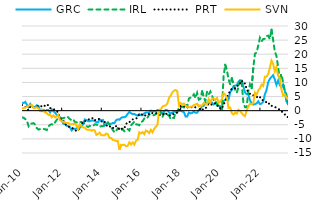
| Category | GRC | IRL | PRT | SVN |
|---|---|---|---|---|
| 2010-01-01 | 2.898 | -2.388 | 1.972 | 0.745 |
| 2010-02-01 | 2.692 | -2.499 | 1.778 | 0.901 |
| 2010-03-01 | 3.107 | -2.991 | 1.419 | 1.082 |
| 2010-04-01 | 2.054 | -3.565 | 0.441 | 1.371 |
| 2010-05-01 | 1.272 | -5.481 | 0.205 | 1.782 |
| 2010-06-01 | 2.364 | -4.56 | 1.414 | 1.905 |
| 2010-07-01 | 1.619 | -4.599 | 1.289 | 2.014 |
| 2010-08-01 | 1.168 | -4.428 | 1.112 | 0.894 |
| 2010-09-01 | 1.32 | -4.962 | 1.247 | 0.995 |
| 2010-10-01 | 1.915 | -6.22 | 1.552 | 1.234 |
| 2010-11-01 | 1.666 | -6.703 | 1.487 | 0.727 |
| 2010-12-01 | 0.033 | -6.511 | 1.717 | -0.137 |
| 2011-01-01 | -0.158 | -6.599 | 1.512 | 0.445 |
| 2011-02-01 | 0.274 | -6.498 | 1.27 | -0.188 |
| 2011-03-01 | -0.094 | -6.58 | 1.902 | -0.566 |
| 2011-04-01 | 0.246 | -6.889 | 2.273 | -0.887 |
| 2011-05-01 | 0.248 | -5.552 | 1.834 | -1.524 |
| 2011-06-01 | -0.63 | -5.024 | 0.917 | -1.443 |
| 2011-07-01 | 0.496 | -4.786 | 0.834 | -2.295 |
| 2011-08-01 | -0.215 | -5.069 | 0.602 | -1.661 |
| 2011-09-01 | -0.697 | -4.142 | 0.242 | -2.383 |
| 2011-10-01 | -1.512 | -3.246 | -0.099 | -2.08 |
| 2011-11-01 | -1.755 | -2.724 | -0.794 | -1.467 |
| 2011-12-01 | -2.446 | -2.401 | -2.714 | -3.39 |
| 2012-01-01 | -3.468 | -2.653 | -3.286 | -3.79 |
| 2012-02-01 | -4.606 | -2.674 | -3.48 | -3.937 |
| 2012-03-01 | -4.694 | -2.387 | -4.624 | -4.128 |
| 2012-04-01 | -5.34 | -2.055 | -5.295 | -4.403 |
| 2012-05-01 | -5.478 | -2.36 | -5.699 | -4.317 |
| 2012-06-01 | -5.829 | -3.04 | -5.745 | -4.872 |
| 2012-07-01 | -6.977 | -3.319 | -6.011 | -4.841 |
| 2012-08-01 | -6.385 | -3.022 | -6.399 | -4.711 |
| 2012-09-01 | -6.487 | -4.053 | -6.779 | -4.584 |
| 2012-10-01 | -6.283 | -4.126 | -7.255 | -5.231 |
| 2012-11-01 | -6.11 | -4.384 | -7.169 | -6.48 |
| 2012-12-01 | -6.116 | -4.02 | -5.235 | -4.842 |
| 2013-01-01 | -5.321 | -4.005 | -4.345 | -5.529 |
| 2013-02-01 | -4.925 | -4.264 | -4.437 | -5.967 |
| 2013-03-01 | -3.099 | -4.637 | -3.68 | -6.027 |
| 2013-04-01 | -3.341 | -5.466 | -3.637 | -6.654 |
| 2013-05-01 | -3.728 | -5.793 | -3.351 | -6.822 |
| 2013-06-01 | -3.758 | -5.38 | -2.763 | -6.722 |
| 2013-07-01 | -3.488 | -5.585 | -2.744 | -7.083 |
| 2013-08-01 | -3.49 | -5.434 | -2.619 | -6.834 |
| 2013-09-01 | -3.687 | -4.842 | -3.431 | -6.989 |
| 2013-10-01 | -4.103 | -4.927 | -3.033 | -8.593 |
| 2013-11-01 | -4.163 | -5.175 | -2.893 | -8.23 |
| 2013-12-01 | -3.098 | -5.704 | -3.041 | -7.811 |
| 2014-01-01 | -3.44 | -5.474 | -3.866 | -8.686 |
| 2014-02-01 | -3.291 | -5.525 | -3.525 | -8.699 |
| 2014-03-01 | -5.211 | -5.033 | -3.858 | -8.706 |
| 2014-04-01 | -4.61 | -4.733 | -5.15 | -8.131 |
| 2014-05-01 | -4.5 | -4.123 | -5.618 | -8.389 |
| 2014-06-01 | -4.65 | -5.007 | -5.436 | -9.663 |
| 2014-07-01 | -4.673 | -5.915 | -6.152 | -9.665 |
| 2014-08-01 | -4.368 | -6.904 | -6.253 | -10.363 |
| 2014-09-01 | -4.38 | -7.708 | -5.413 | -10.508 |
| 2014-10-01 | -3.344 | -7.116 | -5.513 | -10.742 |
| 2014-11-01 | -3.063 | -6.197 | -5.76 | -10.761 |
| 2014-12-01 | -3.204 | -6.402 | -6.81 | -13.906 |
| 2015-01-01 | -2.559 | -7.084 | -6.35 | -12.078 |
| 2015-02-01 | -2.265 | -6.483 | -6.517 | -12.206 |
| 2015-03-01 | -2.354 | -7.343 | -6.168 | -12.054 |
| 2015-04-01 | -1.979 | -6.958 | -4.781 | -12.627 |
| 2015-05-01 | -1.097 | -6.542 | -4.009 | -12.431 |
| 2015-06-01 | -0.476 | -7.049 | -4.091 | -11.191 |
| 2015-07-01 | -0.894 | -5.196 | -3.504 | -11.99 |
| 2015-08-01 | -1.233 | -4.584 | -3.091 | -11.239 |
| 2015-09-01 | -1.145 | -3.87 | -3.093 | -12.051 |
| 2015-10-01 | -1.559 | -4.832 | -2.768 | -10.621 |
| 2015-11-01 | -1.731 | -4.904 | -2.488 | -10.348 |
| 2015-12-01 | -1.218 | -5.167 | -1.152 | -7.646 |
| 2016-01-01 | -1.627 | -4.055 | -1.246 | -8.069 |
| 2016-02-01 | -1.643 | -3.748 | -1.38 | -7.559 |
| 2016-03-01 | -0.957 | -2.765 | -1.871 | -8.35 |
| 2016-04-01 | -0.674 | -2.28 | -1.601 | -7.031 |
| 2016-05-01 | -0.672 | -2.454 | -1.208 | -7.367 |
| 2016-06-01 | -0.592 | -1.294 | -1.176 | -7.968 |
| 2016-07-01 | 0.032 | -1.471 | -0.662 | -6.748 |
| 2016-08-01 | -0.215 | -1.698 | -0.894 | -7.686 |
| 2016-09-01 | -0.177 | -1.55 | -0.777 | -6.476 |
| 2016-10-01 | -0.182 | -1.243 | -0.94 | -5.701 |
| 2016-11-01 | 0.223 | -0.289 | -1.022 | -5.022 |
| 2016-12-01 | -0.194 | 0.165 | -1.423 | 0.351 |
| 2017-01-01 | -0.687 | -0.42 | -1.681 | 0.442 |
| 2017-02-01 | -0.631 | -2.255 | -1.546 | 1.455 |
| 2017-03-01 | -0.325 | -1.055 | -0.88 | 1.704 |
| 2017-04-01 | 0.278 | -0.873 | -0.813 | 1.891 |
| 2017-05-01 | 0.133 | -1.458 | -1.568 | 2.554 |
| 2017-06-01 | -0.586 | -1.744 | -1.671 | 4.551 |
| 2017-07-01 | -1.062 | -2.998 | -1.6 | 5.364 |
| 2017-08-01 | -0.639 | -2.529 | -1.121 | 6.459 |
| 2017-09-01 | -0.4 | -2.576 | -1.226 | 7.064 |
| 2017-10-01 | -0.378 | -0.454 | -1.095 | 7.316 |
| 2017-11-01 | -0.287 | -0.516 | -0.626 | 6.876 |
| 2017-12-01 | 0.022 | 1.224 | -0.254 | 1.942 |
| 2018-01-01 | -0.042 | 1.045 | 1.641 | 2.728 |
| 2018-02-01 | -0.278 | 1.428 | 1.539 | 2.231 |
| 2018-03-01 | -0.534 | 1.154 | 1.701 | 2.562 |
| 2018-04-01 | -2.047 | 2.274 | 1.094 | 1.736 |
| 2018-05-01 | -2.043 | 1.424 | 1.353 | 1.437 |
| 2018-06-01 | -0.682 | 4.293 | 1.063 | 1.164 |
| 2018-07-01 | -0.953 | 4.598 | 1.197 | 1.404 |
| 2018-08-01 | -0.821 | 4.852 | 1.248 | 1.435 |
| 2018-09-01 | -0.29 | 5.783 | 1.395 | 1.975 |
| 2018-10-01 | -0.758 | 4.44 | 1.173 | 2.195 |
| 2018-11-01 | -0.762 | 6.315 | 1.223 | 2.459 |
| 2018-12-01 | 0.229 | 3.91 | 1.846 | 1.5 |
| 2019-01-01 | 0.504 | 4.205 | 0.156 | 1.868 |
| 2019-02-01 | 1.661 | 6.837 | 0.53 | 1.804 |
| 2019-03-01 | 1.698 | 4.833 | 0.319 | 2.785 |
| 2019-04-01 | 2.541 | 3.327 | 0.686 | 2.357 |
| 2019-05-01 | 2.523 | 6.751 | 1.643 | 2.133 |
| 2019-06-01 | 2.572 | 5.761 | 2.528 | 4.126 |
| 2019-07-01 | 2.901 | 6.797 | 2.219 | 2.965 |
| 2019-08-01 | 2.882 | 5.422 | 2.109 | 4.351 |
| 2019-09-01 | 2.187 | 3.773 | 2.27 | 4.322 |
| 2019-10-01 | 2.556 | 3.81 | 2.678 | 3.838 |
| 2019-11-01 | 2.584 | 1.99 | 2.269 | 4.537 |
| 2019-12-01 | 1.829 | 2.318 | 0.928 | 2.735 |
| 2020-01-01 | 1.604 | 1.09 | 0.906 | 3.294 |
| 2020-02-01 | 1.242 | 0.566 | 0.631 | 4.062 |
| 2020-03-01 | 3.358 | 12.058 | 2.334 | 6.2 |
| 2020-04-01 | 3.892 | 16.268 | 3.035 | 5.65 |
| 2020-05-01 | 4.682 | 14.394 | 4.949 | 4.734 |
| 2020-06-01 | 3.921 | 11.117 | 5.659 | 0.99 |
| 2020-07-01 | 6.522 | 9.339 | 7.277 | 1.115 |
| 2020-08-01 | 7.327 | 11.485 | 7.681 | -0.896 |
| 2020-09-01 | 8.533 | 9.013 | 8.057 | -1.36 |
| 2020-10-01 | 8.889 | 7.389 | 7.935 | -0.643 |
| 2020-11-01 | 9.005 | 6.327 | 8.14 | -1.073 |
| 2020-12-01 | 10.226 | 8.441 | 9.496 | 0.324 |
| 2021-01-01 | 10.754 | 11.001 | 9.622 | -0.133 |
| 2021-02-01 | 10.672 | 9.684 | 10.693 | -0.828 |
| 2021-03-01 | 8.545 | 2.861 | 9.608 | -1.61 |
| 2021-04-01 | 6.422 | 1.224 | 9.671 | -1.9 |
| 2021-05-01 | 5.816 | 1.237 | 7.567 | 0.195 |
| 2021-06-01 | 5.873 | 6.963 | 6.461 | 1.395 |
| 2021-07-01 | 3.596 | 9.309 | 5.964 | 2.469 |
| 2021-08-01 | 2.64 | 7.961 | 5.434 | 2.268 |
| 2021-09-01 | 2.129 | 15.263 | 5.448 | 2.637 |
| 2021-10-01 | 2.32 | 20.203 | 5.195 | 6.415 |
| 2021-11-01 | 2.569 | 20.609 | 4.984 | 5.66 |
| 2021-12-01 | 3.303 | 23.132 | 4.474 | 7.178 |
| 2022-01-01 | 2.3 | 25.808 | 4.848 | 7.892 |
| 2022-02-01 | 2.526 | 24.56 | 3.815 | 9.2 |
| 2022-03-01 | 3.187 | 25.385 | 3.701 | 8.733 |
| 2022-04-01 | 5.767 | 25.458 | 3.381 | 12.005 |
| 2022-05-01 | 7.285 | 26.458 | 2.925 | 12.035 |
| 2022-06-01 | 10.051 | 26.57 | 3.054 | 12.977 |
| 2022-07-01 | 11.263 | 25.357 | 1.843 | 15.174 |
| 2022-08-01 | 11.933 | 28.697 | 1.752 | 17.755 |
| 2022-09-01 | 12.55 | 25.171 | 1.448 | 16.647 |
| 2022-10-01 | 11.073 | 21.025 | 1.282 | 13.929 |
| 2022-11-01 | 9.117 | 19.429 | 1.065 | 15.423 |
| 2022-12-01 | 10.629 | 15.533 | 0.822 | 12.381 |
| 2023-01-01 | 9.196 | 11.299 | 0.179 | 11.75 |
| 2023-02-01 | 8.16 | 12.926 | -0.121 | 7.669 |
| 2023-03-01 | 9.254 | 10.125 | -0.786 | 5.367 |
| 2023-04-01 | 7.255 | 7.024 | -1.269 | 5.877 |
| 2023-05-01 | 3.328 | 5.874 | -2.126 | 4.659 |
| 2023-06-01 | 2.491 | 2.247 | -2.307 | 4.215 |